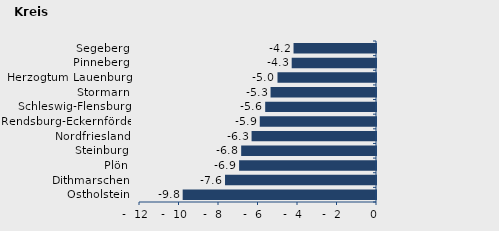
| Category | Überschuss der Geborenen (+) bzw. Gestorbenen (-) |
|---|---|
| Ostholstein | -9.789 |
| Dithmarschen | -7.645 |
| Plön | -6.932 |
| Steinburg | -6.827 |
| Nordfriesland | -6.3 |
| Rendsburg-Eckernförde | -5.886 |
| Schleswig-Flensburg | -5.611 |
| Stormarn | -5.339 |
| Herzogtum Lauenburg | -4.987 |
| Pinneberg | -4.268 |
| Segeberg | -4.176 |